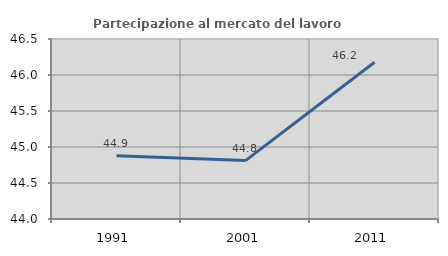
| Category | Partecipazione al mercato del lavoro  femminile |
|---|---|
| 1991.0 | 44.88 |
| 2001.0 | 44.811 |
| 2011.0 | 46.177 |